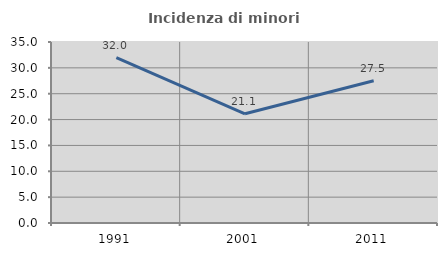
| Category | Incidenza di minori stranieri |
|---|---|
| 1991.0 | 32 |
| 2001.0 | 21.121 |
| 2011.0 | 27.5 |